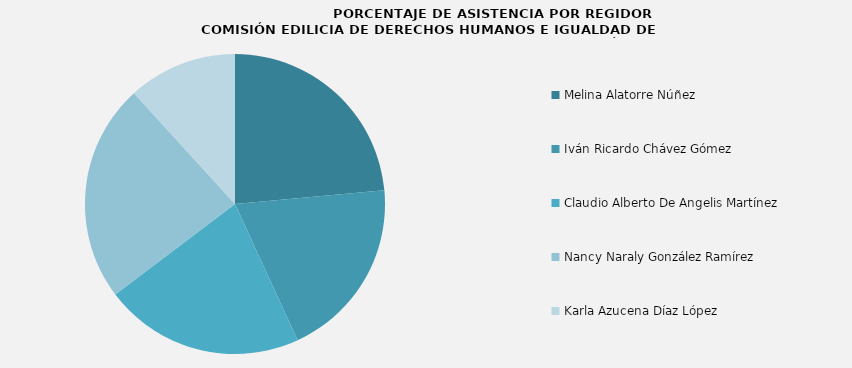
| Category | Series 0 |
|---|---|
| Melina Alatorre Núñez | 100 |
| Iván Ricardo Chávez Gómez | 83.333 |
| Claudio Alberto De Angelis Martínez | 91.667 |
| Nancy Naraly González Ramírez | 100 |
| Karla Azucena Díaz López | 50 |